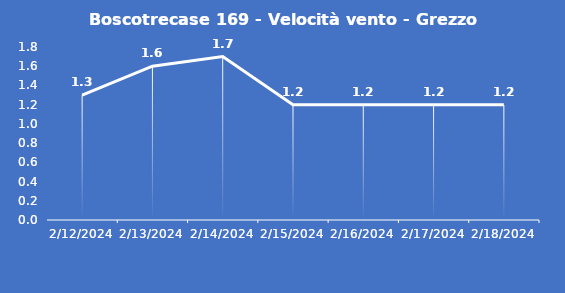
| Category | Boscotrecase 169 - Velocità vento - Grezzo (m/s) |
|---|---|
| 2/12/24 | 1.3 |
| 2/13/24 | 1.6 |
| 2/14/24 | 1.7 |
| 2/15/24 | 1.2 |
| 2/16/24 | 1.2 |
| 2/17/24 | 1.2 |
| 2/18/24 | 1.2 |